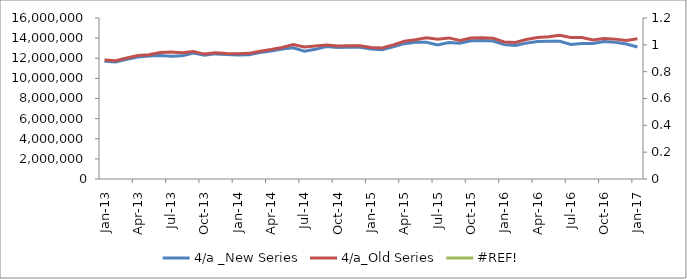
| Category | 4/a _New Series | 4/a_Old Series |
|---|---|---|
| 2013-01-01 | 11698045 | 11818115 |
| 2013-02-01 | 11620928 | 11748042 |
| 2013-03-01 | 11896801 | 12030850 |
| 2013-04-01 | 12132681 | 12262422 |
| 2013-05-01 | 12216079 | 12354071 |
| 2013-06-01 | 12274403 | 12561253 |
| 2013-07-01 | 12200031 | 12615267 |
| 2013-08-01 | 12236880 | 12542642 |
| 2013-09-01 | 12523723 | 12679379 |
| 2013-10-01 | 12297151 | 12412998 |
| 2013-11-01 | 12433976 | 12557625 |
| 2013-12-01 | 12363785 | 12484113 |
| 2014-01-01 | 12329012 | 12447958 |
| 2014-02-01 | 12355589 | 12486017 |
| 2014-03-01 | 12566310 | 12700185 |
| 2014-04-01 | 12730077 | 12868737 |
| 2014-05-01 | 12922571 | 13068558 |
| 2014-06-01 | 13034290 | 13351474 |
| 2014-07-01 | 12701507 | 13109755 |
| 2014-08-01 | 12884711 | 13212186 |
| 2014-09-01 | 13155308 | 13321597 |
| 2014-10-01 | 13072609 | 13211467 |
| 2014-11-01 | 13100694 | 13237370 |
| 2014-12-01 | 13093230 | 13240122 |
| 2015-01-01 | 12913416 | 13058277 |
| 2015-02-01 | 12851205 | 13019198 |
| 2015-03-01 | 13148326 | 13328128 |
| 2015-04-01 | 13451823 | 13681271 |
| 2015-05-01 | 13585611 | 13830442 |
| 2015-06-01 | 13596512 | 14033585 |
| 2015-07-01 | 13318215 | 13891275 |
| 2015-08-01 | 13566414 | 14021397 |
| 2015-09-01 | 13489364 | 13761913 |
| 2015-10-01 | 13741124 | 14004735 |
| 2015-11-01 | 13755572 | 14040015 |
| 2015-12-01 | 13713717 | 13999398 |
| 2016-01-01 | 13352629 | 13620794 |
| 2016-02-01 | 13258741 | 13575109 |
| 2016-03-01 | 13503330 | 13866804 |
| 2016-04-01 | 13665900 | 14069873 |
| 2016-05-01 | 13696518 | 14143311 |
| 2016-06-01 | 13686743 | 14275280 |
| 2016-07-01 | 13362031 | 14067498 |
| 2016-08-01 | 13471407 | 14059476 |
| 2016-09-01 | 13470684 | 13813234 |
| 2016-10-01 | 13660465 | 13962960 |
| 2016-11-01 | 13583875 | 13900383 |
| 2016-12-01 | 13415843 | 13775188 |
| 2017-01-01 | 13115945 | 13932664 |